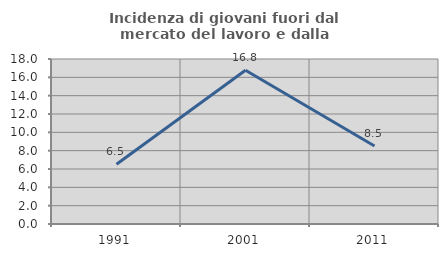
| Category | Incidenza di giovani fuori dal mercato del lavoro e dalla formazione  |
|---|---|
| 1991.0 | 6.512 |
| 2001.0 | 16.779 |
| 2011.0 | 8.511 |